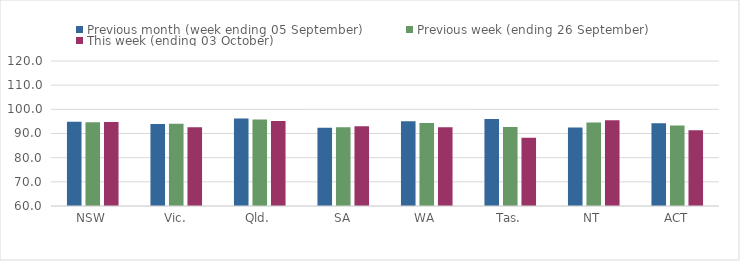
| Category | Previous month (week ending 05 September) | Previous week (ending 26 September) | This week (ending 03 October) |
|---|---|---|---|
| NSW | 94.85 | 94.63 | 94.73 |
| Vic. | 93.89 | 94.03 | 92.58 |
| Qld. | 96.17 | 95.76 | 95.21 |
| SA | 92.43 | 92.61 | 93.03 |
| WA | 95.07 | 94.3 | 92.55 |
| Tas. | 96.02 | 92.65 | 88.29 |
| NT | 92.49 | 94.56 | 95.53 |
| ACT | 94.26 | 93.31 | 91.36 |